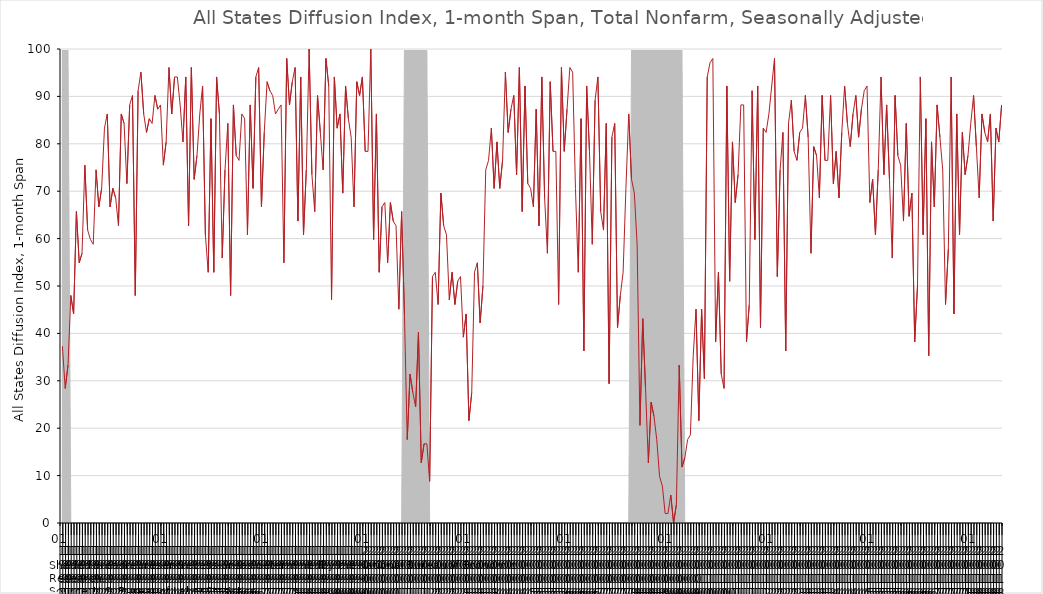
| Category | DI_1month |
|---|---|
| 1991 | 37.3 |
| 1991 | 28.4 |
| 1991 | 33.3 |
| 1991 | 48 |
| 1991 | 44.1 |
| 1991 | 65.7 |
| 1991 | 54.9 |
| 1991 | 56.9 |
| 1991 | 75.5 |
| 1991 | 61.8 |
| 1991 | 59.8 |
| 1991 | 58.8 |
| 1992 | 74.5 |
| 1992 | 66.7 |
| 1992 | 70.6 |
| 1992 | 83.3 |
| 1992 | 86.3 |
| 1992 | 66.7 |
| 1992 | 70.6 |
| 1992 | 68.6 |
| 1992 | 62.7 |
| 1992 | 86.3 |
| 1992 | 84.3 |
| 1992 | 71.6 |
| 1993 | 88.2 |
| 1993 | 90.2 |
| 1993 | 48 |
| 1993 | 91.2 |
| 1993 | 95.1 |
| 1993 | 86.3 |
| 1993 | 82.4 |
| 1993 | 85.3 |
| 1993 | 84.3 |
| 1993 | 90.2 |
| 1993 | 87.3 |
| 1993 | 88.2 |
| 1994 | 75.5 |
| 1994 | 80.4 |
| 1994 | 96.1 |
| 1994 | 86.3 |
| 1994 | 94.1 |
| 1994 | 94.1 |
| 1994 | 88.2 |
| 1994 | 80.4 |
| 1994 | 94.1 |
| 1994 | 62.7 |
| 1994 | 96.1 |
| 1994 | 72.5 |
| 1995 | 77.5 |
| 1995 | 86.3 |
| 1995 | 92.2 |
| 1995 | 60.8 |
| 1995 | 52.9 |
| 1995 | 85.3 |
| 1995 | 52.9 |
| 1995 | 94.1 |
| 1995 | 86.3 |
| 1995 | 55.9 |
| 1995 | 74.5 |
| 1995 | 84.3 |
| 1996 | 48 |
| 1996 | 88.2 |
| 1996 | 77.5 |
| 1996 | 76.5 |
| 1996 | 86.3 |
| 1996 | 85.3 |
| 1996 | 60.8 |
| 1996 | 88.2 |
| 1996 | 70.6 |
| 1996 | 94.1 |
| 1996 | 96.1 |
| 1996 | 66.7 |
| 1997 | 82.4 |
| 1997 | 93.1 |
| 1997 | 91.2 |
| 1997 | 90.2 |
| 1997 | 86.3 |
| 1997 | 87.3 |
| 1997 | 88.2 |
| 1997 | 54.9 |
| 1997 | 98 |
| 1997 | 88.2 |
| 1997 | 93.1 |
| 1997 | 96.1 |
| 1998 | 63.7 |
| 1998 | 94.1 |
| 1998 | 60.8 |
| 1998 | 74.5 |
| 1998 | 100 |
| 1998 | 73.5 |
| 1998 | 65.7 |
| 1998 | 90.2 |
| 1998 | 82.4 |
| 1998 | 74.5 |
| 1998 | 98 |
| 1998 | 92.2 |
| 1999 | 47.1 |
| 1999 | 94.1 |
| 1999 | 83.3 |
| 1999 | 86.3 |
| 1999 | 69.6 |
| 1999 | 92.2 |
| 1999 | 85.3 |
| 1999 | 81.4 |
| 1999 | 66.7 |
| 1999 | 93.1 |
| 1999 | 90.2 |
| 1999 | 94.1 |
| 2000 | 78.4 |
| 2000 | 78.4 |
| 2000 | 100 |
| 2000 | 59.8 |
| 2000 | 86.3 |
| 2000 | 52.9 |
| 2000 | 66.7 |
| 2000 | 67.6 |
| 2000 | 54.9 |
| 2000 | 67.6 |
| 2000 | 63.7 |
| 2000 | 62.7 |
| 2001 | 45.1 |
| 2001 | 65.7 |
| 2001 | 44.1 |
| 2001 | 17.6 |
| 2001 | 31.4 |
| 2001 | 27.5 |
| 2001 | 24.5 |
| 2001 | 40.2 |
| 2001 | 12.7 |
| 2001 | 16.7 |
| 2001 | 16.7 |
| 2001 | 8.8 |
| 2002 | 52 |
| 2002 | 52.9 |
| 2002 | 46.1 |
| 2002 | 69.6 |
| 2002 | 62.7 |
| 2002 | 60.8 |
| 2002 | 47.1 |
| 2002 | 52.9 |
| 2002 | 46.1 |
| 2002 | 51 |
| 2002 | 52 |
| 2002 | 39.2 |
| 2003 | 44.1 |
| 2003 | 21.6 |
| 2003 | 27.5 |
| 2003 | 52.9 |
| 2003 | 54.9 |
| 2003 | 42.2 |
| 2003 | 50 |
| 2003 | 74.5 |
| 2003 | 76.5 |
| 2003 | 83.3 |
| 2003 | 70.6 |
| 2003 | 80.4 |
| 2004 | 70.6 |
| 2004 | 76.5 |
| 2004 | 95.1 |
| 2004 | 82.4 |
| 2004 | 87.3 |
| 2004 | 90.2 |
| 2004 | 73.5 |
| 2004 | 96.1 |
| 2004 | 65.7 |
| 2004 | 92.2 |
| 2004 | 71.6 |
| 2004 | 70.6 |
| 2005 | 66.7 |
| 2005 | 87.3 |
| 2005 | 62.7 |
| 2005 | 94.1 |
| 2005 | 68.6 |
| 2005 | 56.9 |
| 2005 | 93.1 |
| 2005 | 78.4 |
| 2005 | 78.4 |
| 2005 | 46.1 |
| 2005 | 96.1 |
| 2005 | 78.4 |
| 2006 | 87.3 |
| 2006 | 96.1 |
| 2006 | 95.1 |
| 2006 | 70.6 |
| 2006 | 52.9 |
| 2006 | 85.3 |
| 2006 | 36.3 |
| 2006 | 92.2 |
| 2006 | 78.4 |
| 2006 | 58.8 |
| 2006 | 89.2 |
| 2006 | 94.1 |
| 2007 | 65.7 |
| 2007 | 61.8 |
| 2007 | 84.3 |
| 2007 | 29.4 |
| 2007 | 81.4 |
| 2007 | 84.3 |
| 2007 | 41.2 |
| 2007 | 48 |
| 2007 | 52.9 |
| 2007 | 70.6 |
| 2007 | 86.3 |
| 2007 | 72.5 |
| 2008 | 69.6 |
| 2008 | 58.8 |
| 2008 | 20.6 |
| 2008 | 43.1 |
| 2008 | 28.4 |
| 2008 | 12.7 |
| 2008 | 25.5 |
| 2008 | 22.5 |
| 2008 | 17.6 |
| 2008 | 9.8 |
| 2008 | 7.8 |
| 2008 | 2 |
| 2009 | 2 |
| 2009 | 5.9 |
| 2009 | 0 |
| 2009 | 3.9 |
| 2009 | 33.3 |
| 2009 | 11.8 |
| 2009 | 13.7 |
| 2009 | 17.6 |
| 2009 | 18.6 |
| 2009 | 35.3 |
| 2009 | 45.1 |
| 2009 | 21.6 |
| 2010 | 45.1 |
| 2010 | 30.4 |
| 2010 | 94.1 |
| 2010 | 97.1 |
| 2010 | 98 |
| 2010 | 38.2 |
| 2010 | 52.9 |
| 2010 | 31.4 |
| 2010 | 28.4 |
| 2010 | 92.2 |
| 2010 | 51 |
| 2010 | 80.4 |
| 2011 | 67.6 |
| 2011 | 73.5 |
| 2011 | 88.2 |
| 2011 | 88.2 |
| 2011 | 38.2 |
| 2011 | 46.1 |
| 2011 | 91.2 |
| 2011 | 59.8 |
| 2011 | 92.2 |
| 2011 | 41.2 |
| 2011 | 83.3 |
| 2011 | 82.4 |
| 2012 | 86.3 |
| 2012 | 92.2 |
| 2012 | 98 |
| 2012 | 52 |
| 2012 | 74.5 |
| 2012 | 82.4 |
| 2012 | 36.3 |
| 2012 | 84.3 |
| 2012 | 89.2 |
| 2012 | 78.4 |
| 2012 | 76.5 |
| 2012 | 82.4 |
| 2013 | 83.3 |
| 2013 | 90.2 |
| 2013 | 81.4 |
| 2013 | 56.9 |
| 2013 | 79.4 |
| 2013 | 77.5 |
| 2013 | 68.6 |
| 2013 | 90.2 |
| 2013 | 76.5 |
| 2013 | 76.5 |
| 2013 | 90.2 |
| 2013 | 71.6 |
| 2014 | 78.4 |
| 2014 | 68.6 |
| 2014 | 82.4 |
| 2014 | 92.2 |
| 2014 | 84.3 |
| 2014 | 79.4 |
| 2014 | 86.3 |
| 2014 | 90.2 |
| 2014 | 81.4 |
| 2014 | 87.3 |
| 2014 | 91.2 |
| 2014 | 92.2 |
| 2015 | 67.6 |
| 2015 | 72.5 |
| 2015 | 60.8 |
| 2015 | 74.5 |
| 2015 | 94.1 |
| 2015 | 73.5 |
| 2015 | 88.2 |
| 2015 | 72.5 |
| 2015 | 55.9 |
| 2015 | 90.2 |
| 2015 | 77.5 |
| 2015 | 75.5 |
| 2016 | 63.7 |
| 2016 | 84.3 |
| 2016 | 64.7 |
| 2016 | 69.6 |
| 2016 | 38.2 |
| 2016 | 50 |
| 2016 | 94.1 |
| 2016 | 60.8 |
| 2016 | 85.3 |
| 2016 | 35.3 |
| 2016 | 80.4 |
| 2016 | 66.7 |
| 2017 | 88.2 |
| 2017 | 81.4 |
| 2017 | 74.5 |
| 2017 | 46.1 |
| 2017 | 57.8 |
| 2017 | 94.1 |
| 2017 | 44.1 |
| 2017 | 86.3 |
| 2017 | 60.8 |
| 2017 | 82.4 |
| 2017 | 73.5 |
| 2017 | 77.5 |
| 2018 | 84.3 |
| 2018 | 90.2 |
| 2018 | 79.4 |
| 2018 | 68.6 |
| 2018 | 86.3 |
| 2018 | 82.4 |
| 2018 | 80.4 |
| 2018 | 86.3 |
| 2018 | 63.7 |
| 2018 | 83.3 |
| 2018 | 80.4 |
| 2018 | 88.2 |